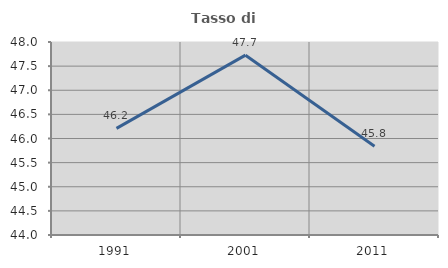
| Category | Tasso di occupazione   |
|---|---|
| 1991.0 | 46.209 |
| 2001.0 | 47.727 |
| 2011.0 | 45.84 |